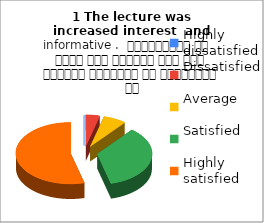
| Category | 1 The lecture was
increased interest  and informative .  व्याख्यान से रुचि में वृद्धि हुई एवं शिक्षण जानकारी से परिपूर्ण था |
|---|---|
| Highly dissatisfied | 0 |
| Dissatisfied | 3 |
| Average | 5 |
| Satisfied | 26 |
| Highly satisfied | 40 |